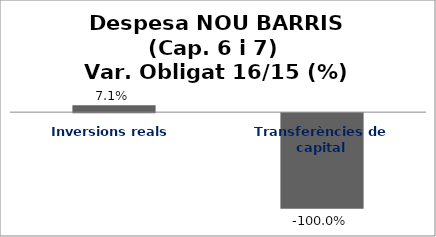
| Category | Series 0 |
|---|---|
| Inversions reals | 0.071 |
| Transferències de capital | -1 |